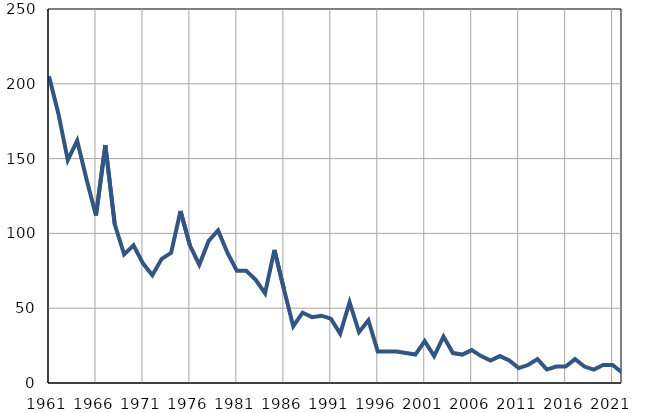
| Category | Умрла 
одојчад |
|---|---|
| 1961.0 | 205 |
| 1962.0 | 180 |
| 1963.0 | 149 |
| 1964.0 | 162 |
| 1965.0 | 136 |
| 1966.0 | 112 |
| 1967.0 | 159 |
| 1968.0 | 106 |
| 1969.0 | 86 |
| 1970.0 | 92 |
| 1971.0 | 80 |
| 1972.0 | 72 |
| 1973.0 | 83 |
| 1974.0 | 87 |
| 1975.0 | 115 |
| 1976.0 | 92 |
| 1977.0 | 79 |
| 1978.0 | 95 |
| 1979.0 | 102 |
| 1980.0 | 87 |
| 1981.0 | 75 |
| 1982.0 | 75 |
| 1983.0 | 69 |
| 1984.0 | 60 |
| 1985.0 | 89 |
| 1986.0 | 63 |
| 1987.0 | 38 |
| 1988.0 | 47 |
| 1989.0 | 44 |
| 1990.0 | 45 |
| 1991.0 | 43 |
| 1992.0 | 33 |
| 1993.0 | 54 |
| 1994.0 | 34 |
| 1995.0 | 42 |
| 1996.0 | 21 |
| 1997.0 | 21 |
| 1998.0 | 21 |
| 1999.0 | 20 |
| 2000.0 | 19 |
| 2001.0 | 28 |
| 2002.0 | 18 |
| 2003.0 | 31 |
| 2004.0 | 20 |
| 2005.0 | 19 |
| 2006.0 | 22 |
| 2007.0 | 18 |
| 2008.0 | 15 |
| 2009.0 | 18 |
| 2010.0 | 15 |
| 2011.0 | 10 |
| 2012.0 | 12 |
| 2013.0 | 16 |
| 2014.0 | 9 |
| 2015.0 | 11 |
| 2016.0 | 11 |
| 2017.0 | 16 |
| 2018.0 | 11 |
| 2019.0 | 9 |
| 2020.0 | 12 |
| 2021.0 | 12 |
| 2022.0 | 7 |